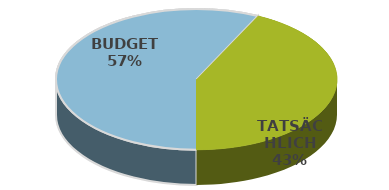
| Category | Series 0 |
|---|---|
| BUDGET | 1085000 |
| TATSÄCHLICH | 812000 |